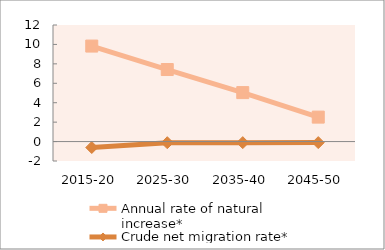
| Category | Annual rate of natural increase* | Crude net migration rate* |
|---|---|---|
| 2015-20 | 9.831 | -0.611 |
| 2025-30 | 7.417 | -0.117 |
| 2035-40 | 5.041 | -0.11 |
| 2045-50 | 2.517 | -0.106 |